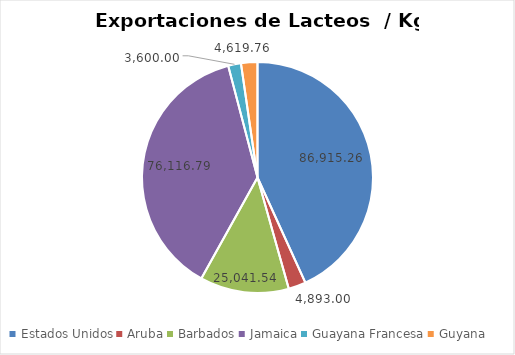
| Category | kg |
|---|---|
| Estados Unidos | 86915.26 |
| Aruba | 4893 |
| Barbados | 25041.539 |
| Jamaica | 76116.791 |
| Guayana Francesa | 3600 |
| Guyana | 4619.76 |